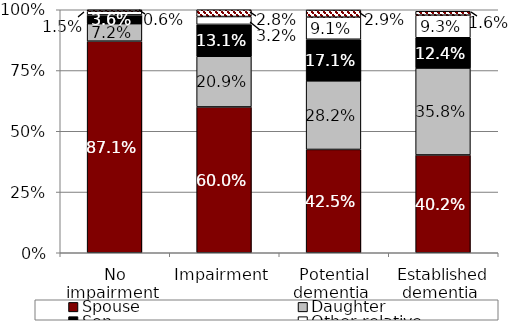
| Category | Spouse | Daughter | Son  | Other relative | Other nonrelative  |
|---|---|---|---|---|---|
| No impairment  | 0.871 | 0.072 | 0.036 | 0.015 | 0.006 |
| Impairment | 0.6 | 0.209 | 0.131 | 0.032 | 0.028 |
| Potential dementia  | 0.425 | 0.282 | 0.171 | 0.091 | 0.029 |
| Established dementia  | 0.402 | 0.358 | 0.124 | 0.093 | 0.016 |